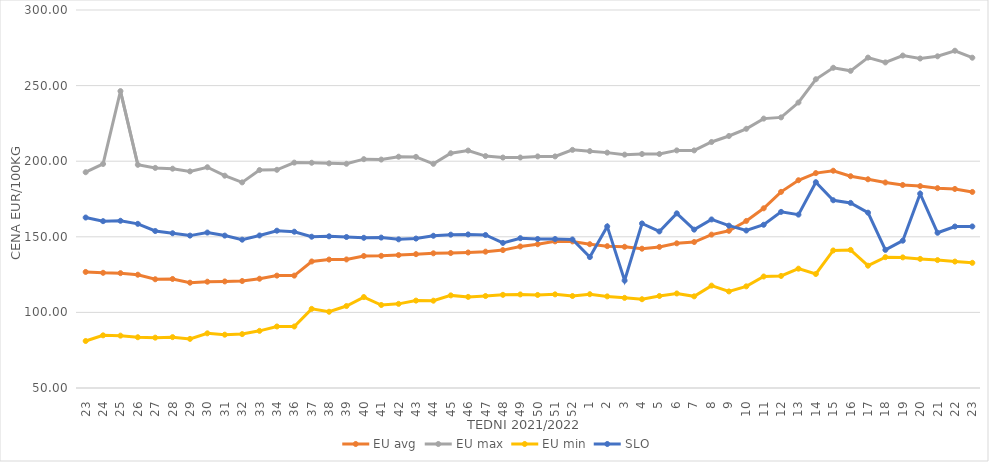
| Category | EU avg | EU max | EU min | SLO |
|---|---|---|---|---|
| 23.0 | 126.76 | 192.72 | 81.087 | 162.75 |
| 24.0 | 126.19 | 198.186 | 84.83 | 160.34 |
| 25.0 | 125.97 | 246.36 | 84.63 | 160.6 |
| 26.0 | 124.92 | 197.607 | 83.57 | 158.57 |
| 27.0 | 121.922 | 195.566 | 83.3 | 153.83 |
| 28.0 | 122.106 | 195.043 | 83.64 | 152.35 |
| 29.0 | 119.659 | 193.272 | 82.49 | 150.79 |
| 30.0 | 120.3 | 196.01 | 86.16 | 152.82 |
| 31.0 | 120.473 | 190.42 | 85.26 | 150.8 |
| 32.0 | 120.756 | 186 | 85.65 | 148.1 |
| 33.0 | 122.274 | 194.145 | 87.8 | 150.88 |
| 34.0 | 124.332 | 194.304 | 90.69 | 154.04 |
| 36.0 | 124.332 | 199.06 | 90.69 | 153.37 |
| 37.0 | 133.685 | 198.97 | 102.334 | 150.06 |
| 38.0 | 134.959 | 198.57 | 100.43 | 150.32 |
| 39.0 | 135.021 | 198.3 | 104.21 | 149.86 |
| 40.0 | 137.315 | 201.34 | 110.15 | 149.34 |
| 41.0 | 137.411 | 201.081 | 104.9 | 149.48 |
| 42.0 | 137.908 | 202.98 | 105.65 | 148.32 |
| 43.0 | 138.52 | 202.856 | 107.8 | 148.83 |
| 44.0 | 139.076 | 198.26 | 107.75 | 150.69 |
| 45.0 | 139.275 | 205.257 | 111.25 | 151.41 |
| 46.0 | 139.626 | 207.046 | 110.26 | 151.56 |
| 47.0 | 140.17 | 203.387 | 110.83 | 151.2 |
| 48.0 | 141.2 | 202.42 | 111.62 | 145.97 |
| 49.0 | 143.614 | 202.45 | 111.89 | 149.07 |
| 50.0 | 145.101 | 203.17 | 111.54 | 148.55 |
| 51.0 | 146.984 | 203.17 | 111.93 | 148.54 |
| 52.0 | 146.958 | 207.5 | 110.85 | 148.22 |
| 1.0 | 145.11 | 206.66 | 112.04 | 136.59 |
| 2.0 | 143.822 | 205.67 | 110.59 | 156.88 |
| 3.0 | 143.402 | 204.34 | 109.62 | 121.07 |
| 4.0 | 142.134 | 204.76 | 108.71 | 158.82 |
| 5.0 | 143.314 | 204.76 | 110.86 | 153.55 |
| 6.0 | 145.677 | 207.14 | 112.52 | 165.51 |
| 7.0 | 146.556 | 207.14 | 110.619 | 154.74 |
| 8.0 | 151.439 | 212.7 | 117.709 | 161.48 |
| 9.0 | 153.947 | 216.67 | 113.871 | 157.38 |
| 10.0 | 160.496 | 221.43 | 117.233 | 154.16 |
| 11.0 | 168.845 | 228.17 | 123.737 | 157.96 |
| 12.0 | 179.714 | 228.97 | 124.105 | 166.49 |
| 13.0 | 187.409 | 238.81 | 128.918 | 164.66 |
| 14.0 | 192.137 | 254.21 | 125.399 | 186.11 |
| 15.0 | 193.697 | 261.79 | 140.954 | 174.18 |
| 16.0 | 190.066 | 259.76 | 141.337 | 172.42 |
| 17.0 | 188.031 | 268.52 | 130.897 | 165.96 |
| 18.0 | 185.925 | 265.34 | 136.529 | 141.36 |
| 19.0 | 184.262 | 269.87 | 136.387 | 147.43 |
| 20.0 | 183.526 | 267.92 | 135.392 | 178.51 |
| 21.0 | 182.168 | 269.38 | 134.589 | 152.67 |
| 22.0 | 181.65 | 273.06 | 133.621 | 156.8 |
| 23.0 | 179.665 | 268.45 | 132.787 | 156.84 |